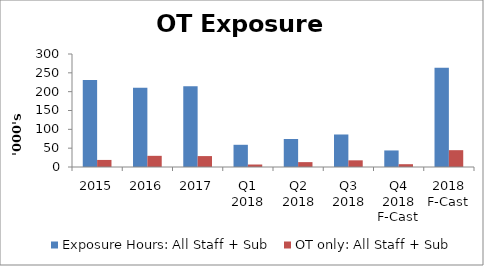
| Category | Exposure Hours: All Staff + Sub | OT only: All Staff + Sub |
|---|---|---|
| 2015 | 231066 | 18760 |
| 2016 | 210544 | 29652 |
| 2017 | 214425 | 28993 |
| Q1 2018 | 58961 | 6591 |
| Q2 2018 | 74397 | 12922.5 |
| Q3 2018 | 86313 | 17710.5 |
| Q4 2018 F-Cast | 43934.2 | 7444.8 |
| 2018 F-Cast | 263605.2 | 44668.8 |